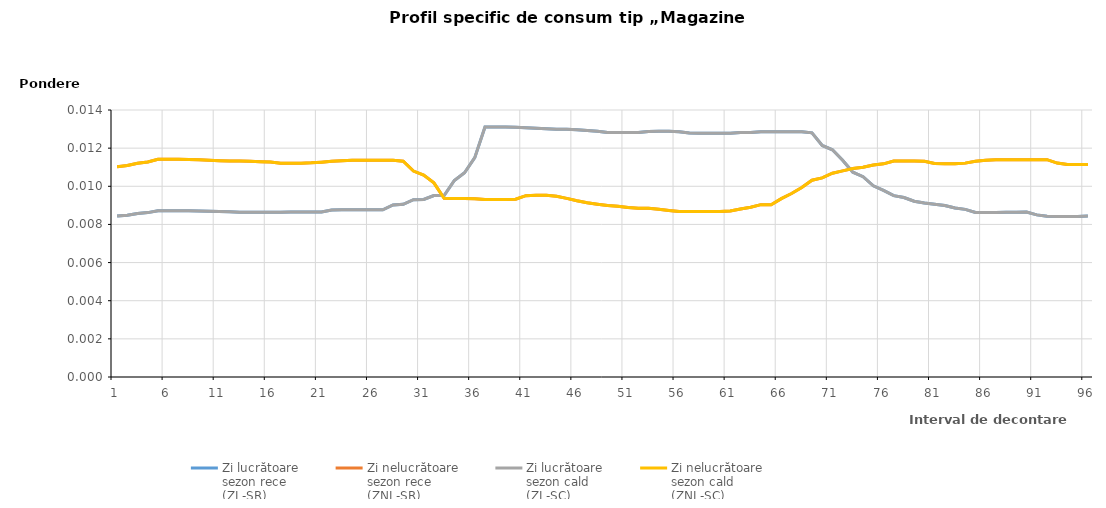
| Category | Zi lucrătoare 
sezon rece
(ZL-SR) | Zi nelucrătoare 
sezon rece
(ZNL-SR) | Zi lucrătoare 
sezon cald
(ZL-SC) | Zi nelucrătoare 
sezon cald
(ZNL-SC) |
|---|---|---|---|---|
| 1.0 | 0.008 | 0.011 | 0.008 | 0.011 |
| 2.0 | 0.008 | 0.011 | 0.008 | 0.011 |
| 3.0 | 0.009 | 0.011 | 0.009 | 0.011 |
| 4.0 | 0.009 | 0.011 | 0.009 | 0.011 |
| 5.0 | 0.009 | 0.011 | 0.009 | 0.011 |
| 6.0 | 0.009 | 0.011 | 0.009 | 0.011 |
| 7.0 | 0.009 | 0.011 | 0.009 | 0.011 |
| 8.0 | 0.009 | 0.011 | 0.009 | 0.011 |
| 9.0 | 0.009 | 0.011 | 0.009 | 0.011 |
| 10.0 | 0.009 | 0.011 | 0.009 | 0.011 |
| 11.0 | 0.009 | 0.011 | 0.009 | 0.011 |
| 12.0 | 0.009 | 0.011 | 0.009 | 0.011 |
| 13.0 | 0.009 | 0.011 | 0.009 | 0.011 |
| 14.0 | 0.009 | 0.011 | 0.009 | 0.011 |
| 15.0 | 0.009 | 0.011 | 0.009 | 0.011 |
| 16.0 | 0.009 | 0.011 | 0.009 | 0.011 |
| 17.0 | 0.009 | 0.011 | 0.009 | 0.011 |
| 18.0 | 0.009 | 0.011 | 0.009 | 0.011 |
| 19.0 | 0.009 | 0.011 | 0.009 | 0.011 |
| 20.0 | 0.009 | 0.011 | 0.009 | 0.011 |
| 21.0 | 0.009 | 0.011 | 0.009 | 0.011 |
| 22.0 | 0.009 | 0.011 | 0.009 | 0.011 |
| 23.0 | 0.009 | 0.011 | 0.009 | 0.011 |
| 24.0 | 0.009 | 0.011 | 0.009 | 0.011 |
| 25.0 | 0.009 | 0.011 | 0.009 | 0.011 |
| 26.0 | 0.009 | 0.011 | 0.009 | 0.011 |
| 27.0 | 0.009 | 0.011 | 0.009 | 0.011 |
| 28.0 | 0.009 | 0.011 | 0.009 | 0.011 |
| 29.0 | 0.009 | 0.011 | 0.009 | 0.011 |
| 30.0 | 0.009 | 0.011 | 0.009 | 0.011 |
| 31.0 | 0.009 | 0.011 | 0.009 | 0.011 |
| 32.0 | 0.01 | 0.01 | 0.01 | 0.01 |
| 33.0 | 0.01 | 0.009 | 0.01 | 0.009 |
| 34.0 | 0.01 | 0.009 | 0.01 | 0.009 |
| 35.0 | 0.011 | 0.009 | 0.011 | 0.009 |
| 36.0 | 0.012 | 0.009 | 0.012 | 0.009 |
| 37.0 | 0.013 | 0.009 | 0.013 | 0.009 |
| 38.0 | 0.013 | 0.009 | 0.013 | 0.009 |
| 39.0 | 0.013 | 0.009 | 0.013 | 0.009 |
| 40.0 | 0.013 | 0.009 | 0.013 | 0.009 |
| 41.0 | 0.013 | 0.01 | 0.013 | 0.01 |
| 42.0 | 0.013 | 0.01 | 0.013 | 0.01 |
| 43.0 | 0.013 | 0.01 | 0.013 | 0.01 |
| 44.0 | 0.013 | 0.009 | 0.013 | 0.009 |
| 45.0 | 0.013 | 0.009 | 0.013 | 0.009 |
| 46.0 | 0.013 | 0.009 | 0.013 | 0.009 |
| 47.0 | 0.013 | 0.009 | 0.013 | 0.009 |
| 48.0 | 0.013 | 0.009 | 0.013 | 0.009 |
| 49.0 | 0.013 | 0.009 | 0.013 | 0.009 |
| 50.0 | 0.013 | 0.009 | 0.013 | 0.009 |
| 51.0 | 0.013 | 0.009 | 0.013 | 0.009 |
| 52.0 | 0.013 | 0.009 | 0.013 | 0.009 |
| 53.0 | 0.013 | 0.009 | 0.013 | 0.009 |
| 54.0 | 0.013 | 0.009 | 0.013 | 0.009 |
| 55.0 | 0.013 | 0.009 | 0.013 | 0.009 |
| 56.0 | 0.013 | 0.009 | 0.013 | 0.009 |
| 57.0 | 0.013 | 0.009 | 0.013 | 0.009 |
| 58.0 | 0.013 | 0.009 | 0.013 | 0.009 |
| 59.0 | 0.013 | 0.009 | 0.013 | 0.009 |
| 60.0 | 0.013 | 0.009 | 0.013 | 0.009 |
| 61.0 | 0.013 | 0.009 | 0.013 | 0.009 |
| 62.0 | 0.013 | 0.009 | 0.013 | 0.009 |
| 63.0 | 0.013 | 0.009 | 0.013 | 0.009 |
| 64.0 | 0.013 | 0.009 | 0.013 | 0.009 |
| 65.0 | 0.013 | 0.009 | 0.013 | 0.009 |
| 66.0 | 0.013 | 0.009 | 0.013 | 0.009 |
| 67.0 | 0.013 | 0.01 | 0.013 | 0.01 |
| 68.0 | 0.013 | 0.01 | 0.013 | 0.01 |
| 69.0 | 0.013 | 0.01 | 0.013 | 0.01 |
| 70.0 | 0.012 | 0.01 | 0.012 | 0.01 |
| 71.0 | 0.012 | 0.011 | 0.012 | 0.011 |
| 72.0 | 0.011 | 0.011 | 0.011 | 0.011 |
| 73.0 | 0.011 | 0.011 | 0.011 | 0.011 |
| 74.0 | 0.011 | 0.011 | 0.011 | 0.011 |
| 75.0 | 0.01 | 0.011 | 0.01 | 0.011 |
| 76.0 | 0.01 | 0.011 | 0.01 | 0.011 |
| 77.0 | 0.01 | 0.011 | 0.01 | 0.011 |
| 78.0 | 0.009 | 0.011 | 0.009 | 0.011 |
| 79.0 | 0.009 | 0.011 | 0.009 | 0.011 |
| 80.0 | 0.009 | 0.011 | 0.009 | 0.011 |
| 81.0 | 0.009 | 0.011 | 0.009 | 0.011 |
| 82.0 | 0.009 | 0.011 | 0.009 | 0.011 |
| 83.0 | 0.009 | 0.011 | 0.009 | 0.011 |
| 84.0 | 0.009 | 0.011 | 0.009 | 0.011 |
| 85.0 | 0.009 | 0.011 | 0.009 | 0.011 |
| 86.0 | 0.009 | 0.011 | 0.009 | 0.011 |
| 87.0 | 0.009 | 0.011 | 0.009 | 0.011 |
| 88.0 | 0.009 | 0.011 | 0.009 | 0.011 |
| 89.0 | 0.009 | 0.011 | 0.009 | 0.011 |
| 90.0 | 0.009 | 0.011 | 0.009 | 0.011 |
| 91.0 | 0.008 | 0.011 | 0.008 | 0.011 |
| 92.0 | 0.008 | 0.011 | 0.008 | 0.011 |
| 93.0 | 0.008 | 0.011 | 0.008 | 0.011 |
| 94.0 | 0.008 | 0.011 | 0.008 | 0.011 |
| 95.0 | 0.008 | 0.011 | 0.008 | 0.011 |
| 96.0 | 0.008 | 0.011 | 0.008 | 0.011 |